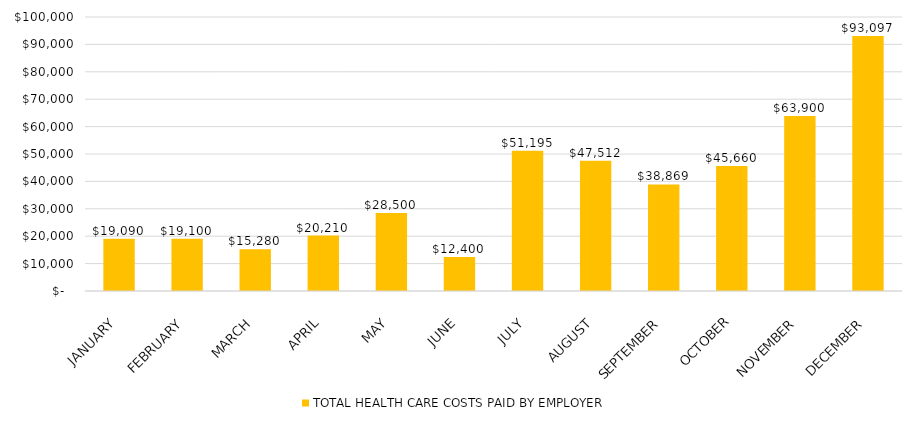
| Category | TOTAL HEALTH CARE COSTS PAID BY EMPLOYER |
|---|---|
| JANUARY | 19090 |
| FEBRUARY | 19100 |
| MARCH | 15280 |
| APRIL | 20210 |
| MAY | 28500 |
| JUNE | 12400 |
| JULY | 51195 |
| AUGUST | 47512 |
| SEPTEMBER | 38869 |
| OCTOBER | 45660 |
| NOVEMBER | 63900 |
| DECEMBER | 93097 |